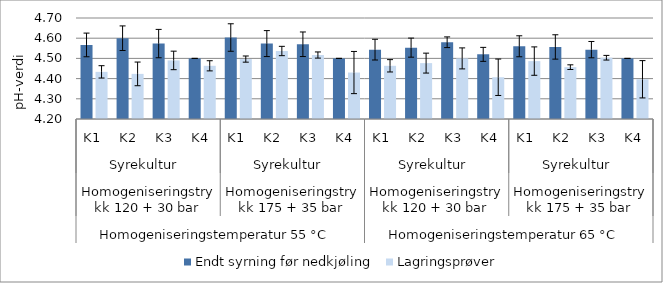
| Category | Endt syrning før nedkjøling | Lagringsprøver |
|---|---|---|
| 0 | 4.567 | 4.433 |
| 1 | 4.6 | 4.423 |
| 2 | 4.573 | 4.49 |
| 3 | 4.5 | 4.463 |
| 4 | 4.603 | 4.497 |
| 5 | 4.573 | 4.537 |
| 6 | 4.57 | 4.517 |
| 7 | 4.5 | 4.43 |
| 8 | 4.543 | 4.463 |
| 9 | 4.553 | 4.477 |
| 10 | 4.58 | 4.5 |
| 11 | 4.52 | 4.407 |
| 12 | 4.56 | 4.487 |
| 13 | 4.557 | 4.457 |
| 14 | 4.543 | 4.503 |
| 15 | 4.5 | 4.397 |